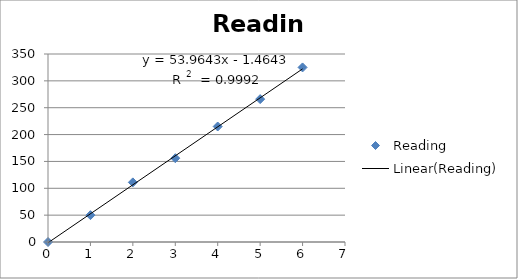
| Category | Reading |
|---|---|
| 0.0 | 0 |
| 1.0 | 50 |
| 2.0 | 111 |
| 3.0 | 156 |
| 4.0 | 215 |
| 5.0 | 266 |
| 6.0 | 325 |